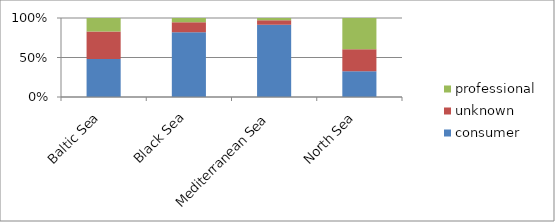
| Category | consumer | unknown | professional |
|---|---|---|---|
| Baltic Sea | 0.482 | 0.347 | 0.171 |
| Black Sea | 0.821 | 0.126 | 0.052 |
| Mediterranean Sea | 0.914 | 0.056 | 0.03 |
| North Sea | 0.326 | 0.277 | 0.397 |